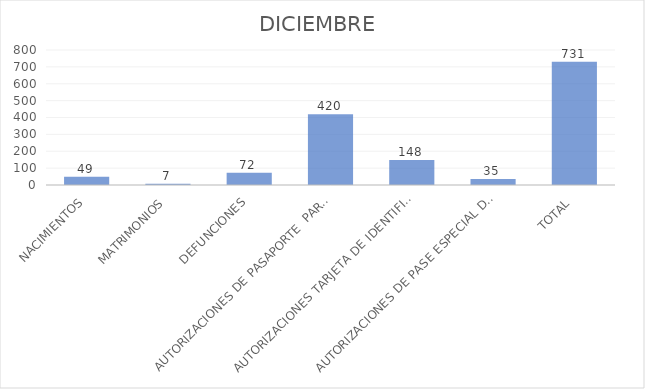
| Category | DICIEMBRE |
|---|---|
| NACIMIENTOS | 49 |
| MATRIMONIOS | 7 |
| DEFUNCIONES | 72 |
| AUTORIZACIONES DE PASAPORTE  PARA MENOR | 420 |
| AUTORIZACIONES TARJETA DE IDENTIFICACIÓN CONSULAR | 148 |
| AUTORIZACIONES DE PASE ESPECIAL DE VIAJE | 35 |
| TOTAL | 731 |